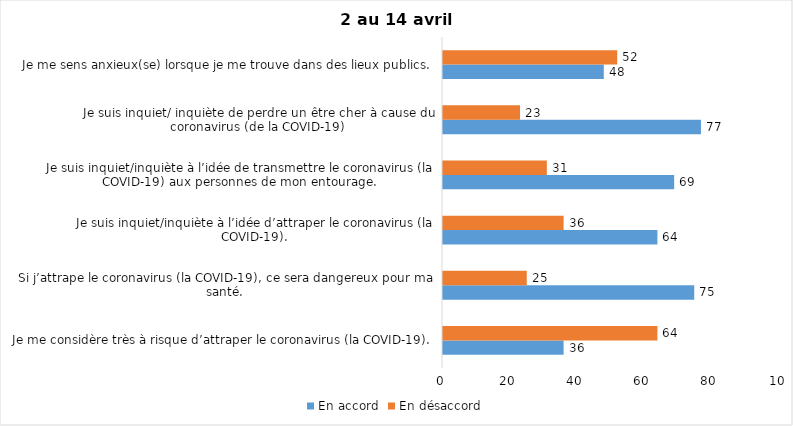
| Category | En accord | En désaccord |
|---|---|---|
| Je me considère très à risque d’attraper le coronavirus (la COVID-19). | 36 | 64 |
| Si j’attrape le coronavirus (la COVID-19), ce sera dangereux pour ma santé. | 75 | 25 |
| Je suis inquiet/inquiète à l’idée d’attraper le coronavirus (la COVID-19). | 64 | 36 |
| Je suis inquiet/inquiète à l’idée de transmettre le coronavirus (la COVID-19) aux personnes de mon entourage. | 69 | 31 |
| Je suis inquiet/ inquiète de perdre un être cher à cause du coronavirus (de la COVID-19) | 77 | 23 |
| Je me sens anxieux(se) lorsque je me trouve dans des lieux publics. | 48 | 52 |